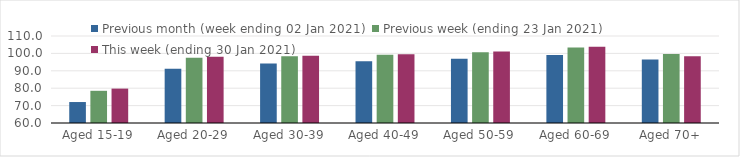
| Category | Previous month (week ending 02 Jan 2021) | Previous week (ending 23 Jan 2021) | This week (ending 30 Jan 2021) |
|---|---|---|---|
| Aged 15-19 | 72.05 | 78.5 | 79.77 |
| Aged 20-29 | 91.24 | 97.56 | 98.05 |
| Aged 30-39 | 94.14 | 98.42 | 98.67 |
| Aged 40-49 | 95.55 | 99.18 | 99.5 |
| Aged 50-59 | 96.9 | 100.73 | 101.16 |
| Aged 60-69 | 99.03 | 103.44 | 103.81 |
| Aged 70+ | 96.51 | 99.72 | 98.32 |